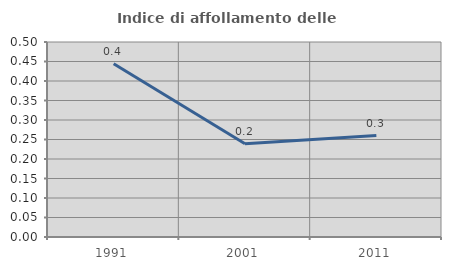
| Category | Indice di affollamento delle abitazioni  |
|---|---|
| 1991.0 | 0.444 |
| 2001.0 | 0.239 |
| 2011.0 | 0.26 |